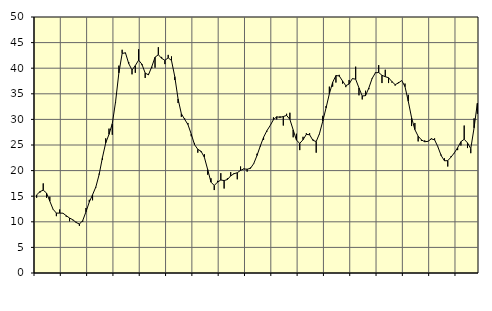
| Category | Piggar | Series 1 |
|---|---|---|
| nan | 14.7 | 15.26 |
| 87.0 | 15.7 | 15.89 |
| 87.0 | 17.5 | 16.18 |
| 87.0 | 14.7 | 15.63 |
| nan | 14.9 | 14.04 |
| 88.0 | 12.4 | 12.45 |
| 88.0 | 11.1 | 11.7 |
| 88.0 | 12.4 | 11.7 |
| nan | 11.7 | 11.68 |
| 89.0 | 11 | 11.19 |
| 89.0 | 10.1 | 10.74 |
| 89.0 | 10.3 | 10.4 |
| nan | 10 | 9.87 |
| 90.0 | 9.2 | 9.56 |
| 90.0 | 10 | 10.23 |
| 90.0 | 12.7 | 11.95 |
| nan | 14.3 | 13.85 |
| 91.0 | 14.2 | 15.28 |
| 91.0 | 16.7 | 16.81 |
| 91.0 | 19.4 | 19.22 |
| nan | 22.1 | 22.54 |
| 92.0 | 26.3 | 25.41 |
| 92.0 | 28.2 | 27.08 |
| 92.0 | 27 | 29.15 |
| nan | 33.3 | 33.45 |
| 93.0 | 40.5 | 39.08 |
| 93.0 | 43.6 | 42.88 |
| 93.0 | 42.9 | 43.01 |
| nan | 41.2 | 40.9 |
| 94.0 | 38.8 | 39.64 |
| 94.0 | 39.1 | 40.51 |
| 94.0 | 43.7 | 41.57 |
| nan | 40.6 | 40.79 |
| 95.0 | 38.1 | 39.05 |
| 95.0 | 38.9 | 38.7 |
| 95.0 | 40 | 40.28 |
| nan | 40.1 | 42.14 |
| 96.0 | 44.1 | 42.63 |
| 96.0 | 42.2 | 41.93 |
| 96.0 | 40.8 | 41.55 |
| nan | 42.6 | 42.02 |
| 97.0 | 42.3 | 41.51 |
| 97.0 | 37.7 | 38.35 |
| 97.0 | 33.2 | 33.99 |
| nan | 30.5 | 31.1 |
| 98.0 | 30.2 | 30.02 |
| 98.0 | 29.3 | 29 |
| 98.0 | 26.7 | 27.15 |
| nan | 25.4 | 25.08 |
| 99.0 | 23.5 | 24.16 |
| 99.0 | 23.6 | 23.77 |
| 99.0 | 23.2 | 22.59 |
| nan | 19.2 | 20.22 |
| 0.0 | 18.5 | 17.75 |
| 0.0 | 16.2 | 17.09 |
| 0.0 | 18 | 17.75 |
| nan | 19.5 | 18.16 |
| 1.0 | 16.5 | 18.06 |
| 1.0 | 18.5 | 18.25 |
| 1.0 | 19.7 | 18.97 |
| nan | 19.5 | 19.39 |
| 2.0 | 18.3 | 19.58 |
| 2.0 | 20.8 | 20.05 |
| 2.0 | 20.4 | 20.32 |
| nan | 19.8 | 20.27 |
| 3.0 | 20.6 | 20.44 |
| 3.0 | 21.3 | 21.36 |
| 3.0 | 23.3 | 22.95 |
| nan | 24.7 | 24.79 |
| 4.0 | 26 | 26.51 |
| 4.0 | 27.6 | 27.78 |
| 4.0 | 28.8 | 28.79 |
| nan | 30.4 | 29.95 |
| 5.0 | 30 | 30.51 |
| 5.0 | 30.6 | 30.4 |
| 5.0 | 28.8 | 30.56 |
| nan | 31.1 | 30.78 |
| 6.0 | 31.3 | 30 |
| 6.0 | 26.5 | 27.95 |
| 6.0 | 27.2 | 25.94 |
| nan | 24 | 25.32 |
| 7.0 | 26.6 | 26.03 |
| 7.0 | 27.3 | 27.07 |
| 7.0 | 27.3 | 27 |
| nan | 26.1 | 25.91 |
| 8.0 | 23.5 | 25.67 |
| 8.0 | 27.1 | 27.23 |
| 8.0 | 30.7 | 29.65 |
| nan | 32.6 | 32.25 |
| 9.0 | 36.4 | 35 |
| 9.0 | 36.4 | 37.24 |
| 9.0 | 37.2 | 38.56 |
| nan | 38.7 | 38.49 |
| 10.0 | 37 | 37.52 |
| 10.0 | 36.3 | 36.58 |
| 10.0 | 37.7 | 36.91 |
| nan | 38 | 37.97 |
| 11.0 | 40.3 | 37.85 |
| 11.0 | 34.7 | 36.15 |
| 11.0 | 33.9 | 34.57 |
| nan | 35.6 | 34.64 |
| 12.0 | 35.9 | 36.13 |
| 12.0 | 37.9 | 37.99 |
| 12.0 | 39.2 | 39.1 |
| nan | 40.6 | 39.16 |
| 13.0 | 37.1 | 38.61 |
| 13.0 | 39.7 | 38.34 |
| 13.0 | 37.1 | 38.14 |
| nan | 37.2 | 37.4 |
| 14.0 | 36.6 | 36.79 |
| 14.0 | 37.3 | 37.11 |
| 14.0 | 37.6 | 37.6 |
| nan | 37 | 36.39 |
| 15.0 | 34.8 | 33.53 |
| 15.0 | 28.7 | 30.34 |
| 15.0 | 29.3 | 28.01 |
| nan | 25.7 | 26.72 |
| 16.0 | 25.8 | 26 |
| 16.0 | 25.9 | 25.63 |
| 16.0 | 25.7 | 25.72 |
| nan | 26.3 | 26.19 |
| 17.0 | 26.3 | 26.02 |
| 17.0 | 24.6 | 24.64 |
| 17.0 | 23.1 | 22.93 |
| nan | 22.4 | 21.92 |
| 18.0 | 20.8 | 21.94 |
| 18.0 | 22.8 | 22.64 |
| 18.0 | 23.4 | 23.47 |
| nan | 24 | 24.47 |
| 19.0 | 24.9 | 25.65 |
| 19.0 | 28.8 | 26.12 |
| 19.0 | 24.4 | 25.42 |
| nan | 23.4 | 24.29 |
| 20.0 | 30.2 | 28.35 |
| 20.0 | 31.1 | 33.15 |